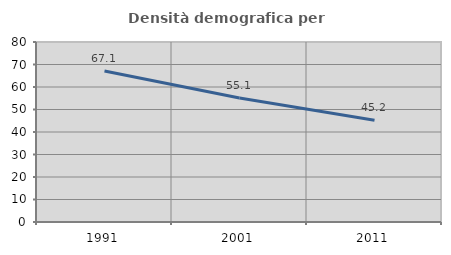
| Category | Densità demografica |
|---|---|
| 1991.0 | 67.137 |
| 2001.0 | 55.114 |
| 2011.0 | 45.194 |